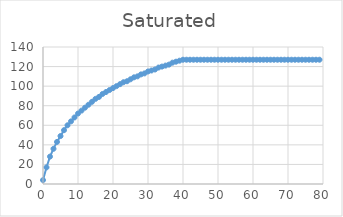
| Category | Series 0 |
|---|---|
| 0.0 | 4 |
| 1.0 | 17 |
| 2.0 | 28 |
| 3.0 | 36 |
| 4.0 | 43 |
| 5.0 | 49 |
| 6.0 | 55 |
| 7.0 | 60 |
| 8.0 | 64 |
| 9.0 | 68 |
| 10.0 | 72 |
| 11.0 | 75 |
| 12.0 | 78 |
| 13.0 | 81 |
| 14.0 | 84 |
| 15.0 | 87 |
| 16.0 | 89 |
| 17.0 | 92 |
| 18.0 | 94 |
| 19.0 | 96 |
| 20.0 | 98 |
| 21.0 | 100 |
| 22.0 | 102 |
| 23.0 | 104 |
| 24.0 | 105 |
| 25.0 | 107 |
| 26.0 | 109 |
| 27.0 | 110 |
| 28.0 | 112 |
| 29.0 | 113 |
| 30.0 | 115 |
| 31.0 | 116 |
| 32.0 | 117 |
| 33.0 | 119 |
| 34.0 | 120 |
| 35.0 | 121 |
| 36.0 | 122 |
| 37.0 | 124 |
| 38.0 | 125 |
| 39.0 | 126 |
| 40.0 | 127 |
| 41.0 | 127 |
| 42.0 | 127 |
| 43.0 | 127 |
| 44.0 | 127 |
| 45.0 | 127 |
| 46.0 | 127 |
| 47.0 | 127 |
| 48.0 | 127 |
| 49.0 | 127 |
| 50.0 | 127 |
| 51.0 | 127 |
| 52.0 | 127 |
| 53.0 | 127 |
| 54.0 | 127 |
| 55.0 | 127 |
| 56.0 | 127 |
| 57.0 | 127 |
| 58.0 | 127 |
| 59.0 | 127 |
| 60.0 | 127 |
| 61.0 | 127 |
| 62.0 | 127 |
| 63.0 | 127 |
| 64.0 | 127 |
| 65.0 | 127 |
| 66.0 | 127 |
| 67.0 | 127 |
| 68.0 | 127 |
| 69.0 | 127 |
| 70.0 | 127 |
| 71.0 | 127 |
| 72.0 | 127 |
| 73.0 | 127 |
| 74.0 | 127 |
| 75.0 | 127 |
| 76.0 | 127 |
| 77.0 | 127 |
| 78.0 | 127 |
| 79.0 | 127 |